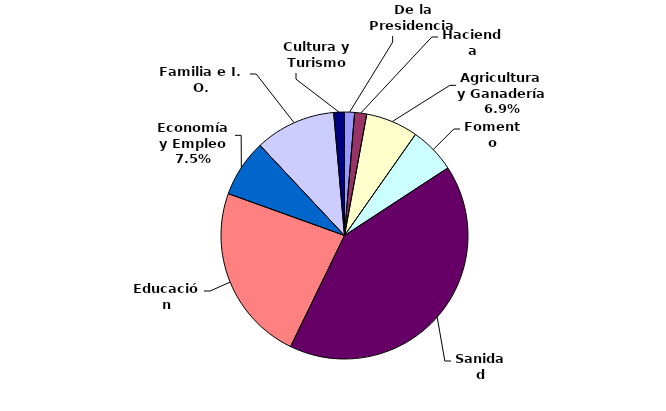
| Category | Series 0 |
|---|---|
| De la Presidencia | 103539 |
| Hacienda | 124452.1 |
| Agricultura y Ganadería | 540674.3 |
| Fomento | 476713.2 |
| Sanidad | 3267410.9 |
| Educación | 1839317.1 |
| Economía y Empleo | 593210 |
| Familia e I. O. | 834682 |
| Cultura y Turismo | 110528.6 |